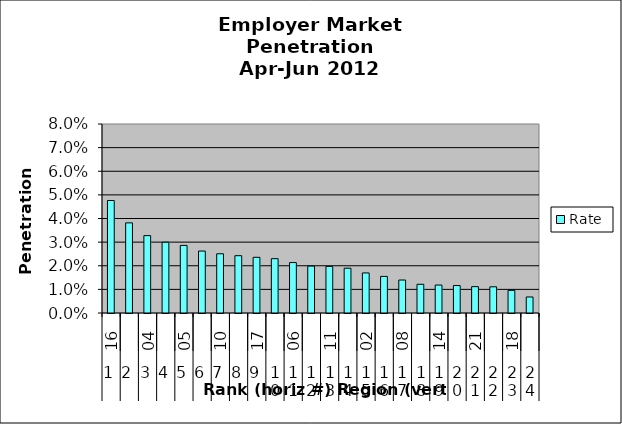
| Category | Rate |
|---|---|
| 0 | 0.048 |
| 1 | 0.038 |
| 2 | 0.033 |
| 3 | 0.03 |
| 4 | 0.029 |
| 5 | 0.026 |
| 6 | 0.025 |
| 7 | 0.024 |
| 8 | 0.024 |
| 9 | 0.023 |
| 10 | 0.021 |
| 11 | 0.02 |
| 12 | 0.02 |
| 13 | 0.019 |
| 14 | 0.017 |
| 15 | 0.015 |
| 16 | 0.014 |
| 17 | 0.012 |
| 18 | 0.012 |
| 19 | 0.012 |
| 20 | 0.011 |
| 21 | 0.011 |
| 22 | 0.01 |
| 23 | 0.007 |